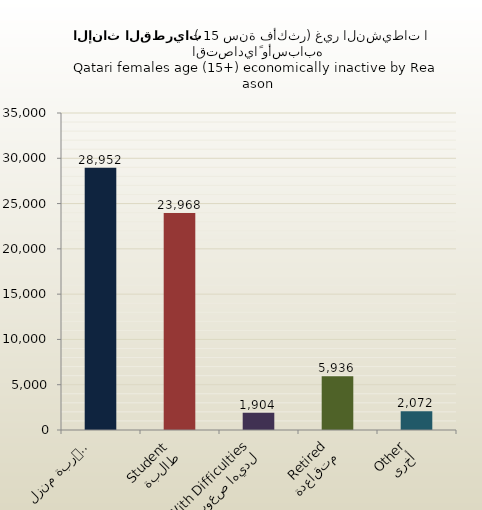
| Category | الاناث القطريات |
|---|---|
| ربة منزل
Homemaker | 28952 |
| طالبة
Student | 23968 |
| لديها صعوبات
With Difficulties | 1904 |
| متقاعدة
Retired | 5936 |
| أخرى
Other | 2072 |